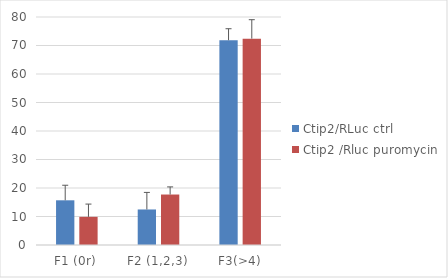
| Category | Ctip2/RLuc ctrl | Ctip2 /Rluc puromycin |
|---|---|---|
| F1 (0r) | 15.685 | 9.878 |
| F2 (1,2,3) | 12.467 | 17.711 |
| F3(>4) | 71.849 | 72.41 |